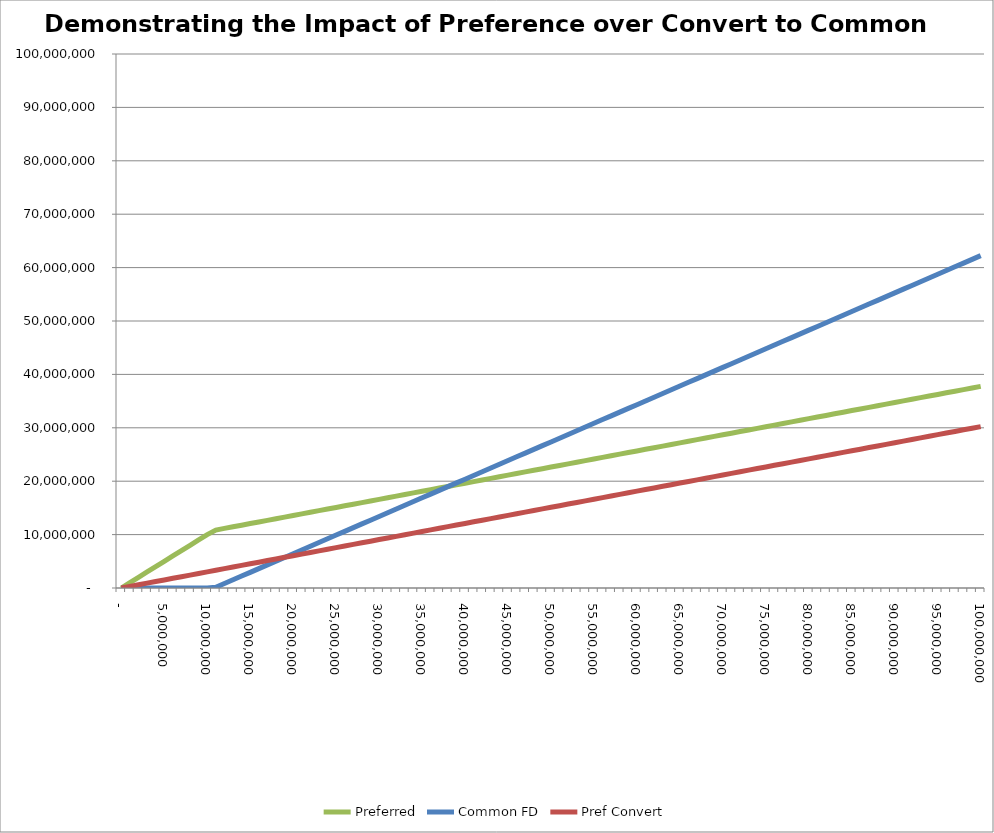
| Category | Preferred | Common FD | Pref Convert |
|---|---|---|---|
| 0.0 | 0 | 0 | 0 |
| 1000000.0 | 1000000 | 0 | 302279.066 |
| 2000000.0 | 2000000 | 0 | 604558.132 |
| 3000000.0 | 3000000 | 0 | 906837.198 |
| 4000000.0 | 4000000 | 0 | 1209116.264 |
| 5000000.0 | 5000000 | 0 | 1511395.33 |
| 6000000.0 | 6000000 | 0 | 1813674.396 |
| 7000000.0 | 7000000 | 0 | 2115953.462 |
| 8000000.0 | 8000000 | 0 | 2418232.528 |
| 9000000.0 | 9000000 | 0 | 2720511.594 |
| 10000000.0 | 10000000 | 0 | 3022790.66 |
| 11000000.0 | 10856705.554 | 143294.446 | 3325069.726 |
| 12000000.0 | 11158984.62 | 841015.38 | 3627348.792 |
| 13000000.0 | 11461263.686 | 1538736.314 | 3929627.858 |
| 14000000.0 | 11763542.752 | 2236457.248 | 4231906.924 |
| 15000000.0 | 12065821.818 | 2934178.182 | 4534185.989 |
| 16000000.0 | 12368100.883 | 3631899.117 | 4836465.055 |
| 17000000.0 | 12670379.949 | 4329620.051 | 5138744.121 |
| 18000000.0 | 12972659.015 | 5027340.985 | 5441023.187 |
| 19000000.0 | 13274938.081 | 5725061.919 | 5743302.253 |
| 20000000.0 | 13577217.147 | 6422782.853 | 6045581.319 |
| 21000000.0 | 13879496.213 | 7120503.787 | 6347860.385 |
| 22000000.0 | 14181775.279 | 7818224.721 | 6650139.451 |
| 23000000.0 | 14484054.345 | 8515945.655 | 6952418.517 |
| 24000000.0 | 14786333.411 | 9213666.589 | 7254697.583 |
| 25000000.0 | 15088612.477 | 9911387.523 | 7556976.649 |
| 26000000.0 | 15390891.543 | 10609108.457 | 7859255.715 |
| 27000000.0 | 15693170.609 | 11306829.391 | 8161534.781 |
| 28000000.0 | 15995449.675 | 12004550.325 | 8463813.847 |
| 29000000.0 | 16297728.741 | 12702271.259 | 8766092.913 |
| 30000000.0 | 16600007.807 | 13399992.193 | 9068371.979 |
| 31000000.0 | 16902286.873 | 14097713.127 | 9370651.045 |
| 32000000.0 | 17204565.939 | 14795434.061 | 9672930.111 |
| 33000000.0 | 17506845.005 | 15493154.995 | 9975209.177 |
| 34000000.0 | 17809124.071 | 16190875.929 | 10277488.243 |
| 35000000.0 | 18111403.137 | 16888596.863 | 10579767.309 |
| 36000000.0 | 18413682.203 | 17586317.797 | 10882046.375 |
| 37000000.0 | 18715961.269 | 18284038.731 | 11184325.441 |
| 38000000.0 | 19018240.335 | 18981759.665 | 11486604.507 |
| 39000000.0 | 19320519.401 | 19679480.599 | 11788883.573 |
| 40000000.0 | 19622798.467 | 20377201.533 | 12091162.639 |
| 41000000.0 | 19925077.533 | 21074922.467 | 12393441.705 |
| 42000000.0 | 20227356.599 | 21772643.401 | 12695720.771 |
| 43000000.0 | 20529635.665 | 22470364.335 | 12997999.837 |
| 44000000.0 | 20831914.731 | 23168085.269 | 13300278.902 |
| 45000000.0 | 21134193.796 | 23865806.204 | 13602557.968 |
| 46000000.0 | 21436472.862 | 24563527.138 | 13904837.034 |
| 47000000.0 | 21738751.928 | 25261248.072 | 14207116.1 |
| 48000000.0 | 22041030.994 | 25958969.006 | 14509395.166 |
| 49000000.0 | 22343310.06 | 26656689.94 | 14811674.232 |
| 50000000.0 | 22645589.126 | 27354410.874 | 15113953.298 |
| 51000000.0 | 22947868.192 | 28052131.808 | 15416232.364 |
| 52000000.0 | 23250147.258 | 28749852.742 | 15718511.43 |
| 53000000.0 | 23552426.324 | 29447573.676 | 16020790.496 |
| 54000000.0 | 23854705.39 | 30145294.61 | 16323069.562 |
| 55000000.0 | 24156984.456 | 30843015.544 | 16625348.628 |
| 56000000.0 | 24459263.522 | 31540736.478 | 16927627.694 |
| 57000000.0 | 24761542.588 | 32238457.412 | 17229906.76 |
| 58000000.0 | 25063821.654 | 32936178.346 | 17532185.826 |
| 59000000.0 | 25366100.72 | 33633899.28 | 17834464.892 |
| 60000000.0 | 25668379.786 | 34331620.214 | 18136743.958 |
| 61000000.0 | 25970658.852 | 35029341.148 | 18439023.024 |
| 62000000.0 | 26272937.918 | 35727062.082 | 18741302.09 |
| 63000000.0 | 26575216.984 | 36424783.016 | 19043581.156 |
| 64000000.0 | 26877496.05 | 37122503.95 | 19345860.222 |
| 65000000.0 | 27179775.116 | 37820224.884 | 19648139.288 |
| 66000000.0 | 27482054.182 | 38517945.818 | 19950418.354 |
| 67000000.0 | 27784333.248 | 39215666.752 | 20252697.42 |
| 68000000.0 | 28086612.314 | 39913387.686 | 20554976.486 |
| 69000000.0 | 28388891.38 | 40611108.62 | 20857255.552 |
| 70000000.0 | 28691170.446 | 41308829.554 | 21159534.618 |
| 71000000.0 | 28993449.512 | 42006550.488 | 21461813.684 |
| 72000000.0 | 29295728.578 | 42704271.422 | 21764092.75 |
| 73000000.0 | 29598007.644 | 43401992.356 | 22066371.815 |
| 74000000.0 | 29900286.709 | 44099713.291 | 22368650.881 |
| 75000000.0 | 30202565.775 | 44797434.225 | 22670929.947 |
| 76000000.0 | 30504844.841 | 45495155.159 | 22973209.013 |
| 77000000.0 | 30807123.907 | 46192876.093 | 23275488.079 |
| 78000000.0 | 31109402.973 | 46890597.027 | 23577767.145 |
| 79000000.0 | 31411682.039 | 47588317.961 | 23880046.211 |
| 80000000.0 | 31713961.105 | 48286038.895 | 24182325.277 |
| 81000000.0 | 32016240.171 | 48983759.829 | 24484604.343 |
| 82000000.0 | 32318519.237 | 49681480.763 | 24786883.409 |
| 83000000.0 | 32620798.303 | 50379201.697 | 25089162.475 |
| 84000000.0 | 32923077.369 | 51076922.631 | 25391441.541 |
| 85000000.0 | 33225356.435 | 51774643.565 | 25693720.607 |
| 86000000.0 | 33527635.501 | 52472364.499 | 25995999.673 |
| 87000000.0 | 33829914.567 | 53170085.433 | 26298278.739 |
| 88000000.0 | 34132193.633 | 53867806.367 | 26600557.805 |
| 89000000.0 | 34434472.699 | 54565527.301 | 26902836.871 |
| 90000000.0 | 34736751.765 | 55263248.235 | 27205115.937 |
| 91000000.0 | 35039030.831 | 55960969.169 | 27507395.003 |
| 92000000.0 | 35341309.897 | 56658690.103 | 27809674.069 |
| 93000000.0 | 35643588.963 | 57356411.037 | 28111953.135 |
| 94000000.0 | 35945868.029 | 58054131.971 | 28414232.201 |
| 95000000.0 | 36248147.095 | 58751852.905 | 28716511.267 |
| 96000000.0 | 36550426.161 | 59449573.839 | 29018790.333 |
| 97000000.0 | 36852705.227 | 60147294.773 | 29321069.399 |
| 98000000.0 | 37154984.293 | 60845015.707 | 29623348.465 |
| 99000000.0 | 37457263.359 | 61542736.641 | 29925627.531 |
| 100000000.0 | 37759542.425 | 62240457.575 | 30227906.597 |